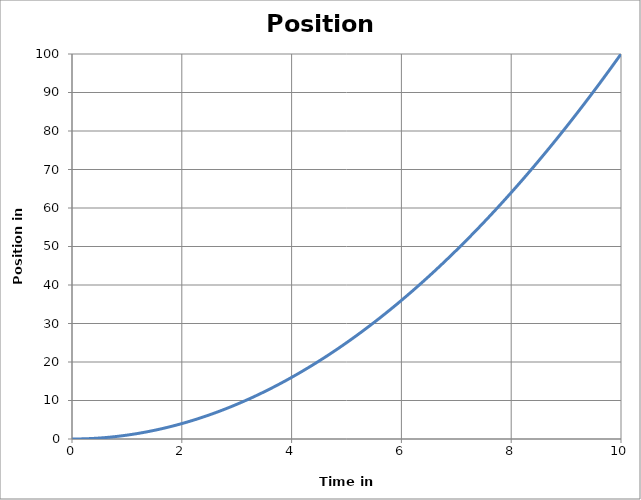
| Category | Position (m) |
|---|---|
| 0.0 | 0 |
| 0.1 | 0.01 |
| 0.2 | 0.04 |
| 0.30000000000000004 | 0.09 |
| 0.4 | 0.16 |
| 0.5 | 0.25 |
| 0.6 | 0.36 |
| 0.7 | 0.49 |
| 0.7999999999999999 | 0.64 |
| 0.8999999999999999 | 0.81 |
| 0.9999999999999999 | 1 |
| 1.0999999999999999 | 1.21 |
| 1.2 | 1.44 |
| 1.3 | 1.69 |
| 1.4000000000000001 | 1.96 |
| 1.5000000000000002 | 2.25 |
| 1.6000000000000003 | 2.56 |
| 1.7000000000000004 | 2.89 |
| 1.8000000000000005 | 3.24 |
| 1.9000000000000006 | 3.61 |
| 2.0000000000000004 | 4 |
| 2.1000000000000005 | 4.41 |
| 2.2000000000000006 | 4.84 |
| 2.3000000000000007 | 5.29 |
| 2.400000000000001 | 5.76 |
| 2.500000000000001 | 6.25 |
| 2.600000000000001 | 6.76 |
| 2.700000000000001 | 7.29 |
| 2.800000000000001 | 7.84 |
| 2.9000000000000012 | 8.41 |
| 3.0000000000000013 | 9 |
| 3.1000000000000014 | 9.61 |
| 3.2000000000000015 | 10.24 |
| 3.3000000000000016 | 10.89 |
| 3.4000000000000017 | 11.56 |
| 3.5000000000000018 | 12.25 |
| 3.600000000000002 | 12.96 |
| 3.700000000000002 | 13.69 |
| 3.800000000000002 | 14.44 |
| 3.900000000000002 | 15.21 |
| 4.000000000000002 | 16 |
| 4.100000000000001 | 16.81 |
| 4.200000000000001 | 17.64 |
| 4.300000000000001 | 18.49 |
| 4.4 | 19.36 |
| 4.5 | 20.25 |
| 4.6 | 21.16 |
| 4.699999999999999 | 22.09 |
| 4.799999999999999 | 23.04 |
| 4.899999999999999 | 24.01 |
| 4.999999999999998 | 25 |
| 5.099999999999998 | 26.01 |
| 5.1999999999999975 | 27.04 |
| 5.299999999999997 | 28.09 |
| 5.399999999999997 | 29.16 |
| 5.4999999999999964 | 30.25 |
| 5.599999999999996 | 31.36 |
| 5.699999999999996 | 32.49 |
| 5.799999999999995 | 33.64 |
| 5.899999999999995 | 34.81 |
| 5.999999999999995 | 36 |
| 6.099999999999994 | 37.21 |
| 6.199999999999994 | 38.44 |
| 6.299999999999994 | 39.69 |
| 6.399999999999993 | 40.96 |
| 6.499999999999993 | 42.25 |
| 6.5999999999999925 | 43.56 |
| 6.699999999999992 | 44.89 |
| 6.799999999999992 | 46.24 |
| 6.8999999999999915 | 47.61 |
| 6.999999999999991 | 49 |
| 7.099999999999991 | 50.41 |
| 7.19999999999999 | 51.84 |
| 7.29999999999999 | 53.29 |
| 7.39999999999999 | 54.76 |
| 7.499999999999989 | 56.25 |
| 7.599999999999989 | 57.76 |
| 7.699999999999989 | 59.29 |
| 7.799999999999988 | 60.84 |
| 7.899999999999988 | 62.41 |
| 7.999999999999988 | 64 |
| 8.099999999999987 | 65.61 |
| 8.199999999999987 | 67.24 |
| 8.299999999999986 | 68.89 |
| 8.399999999999986 | 70.56 |
| 8.499999999999986 | 72.25 |
| 8.599999999999985 | 73.96 |
| 8.699999999999985 | 75.69 |
| 8.799999999999985 | 77.44 |
| 8.899999999999984 | 79.21 |
| 8.999999999999984 | 81 |
| 9.099999999999984 | 82.81 |
| 9.199999999999983 | 84.64 |
| 9.299999999999983 | 86.49 |
| 9.399999999999983 | 88.36 |
| 9.499999999999982 | 90.25 |
| 9.599999999999982 | 92.16 |
| 9.699999999999982 | 94.09 |
| 9.799999999999981 | 96.04 |
| 9.89999999999998 | 98.01 |
| 9.99999999999998 | 100 |